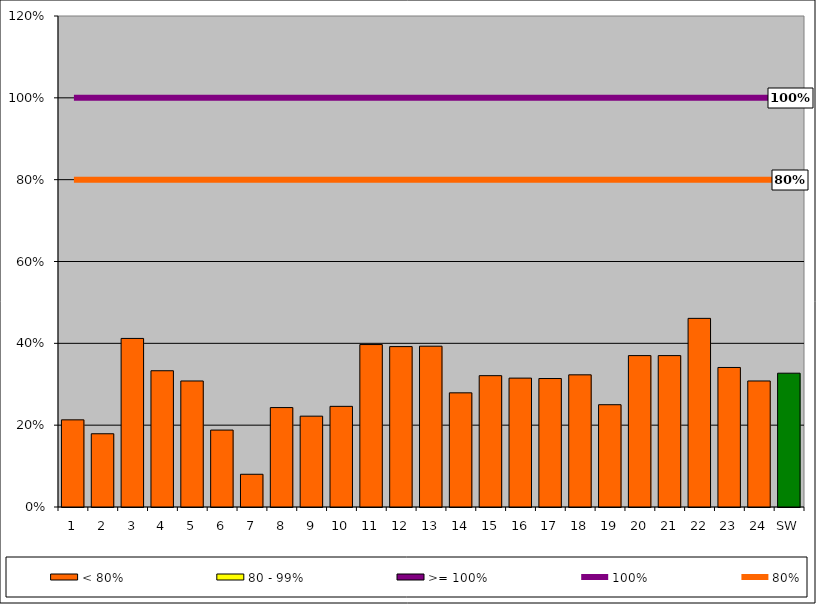
| Category | < 80% | 80 - 99% | >= 100% |
|---|---|---|---|
| 1 | 0.213 | 0 | 0 |
| 2 | 0.179 | 0 | 0 |
| 3 | 0.412 | 0 | 0 |
| 4 | 0.333 | 0 | 0 |
| 5 | 0.308 | 0 | 0 |
| 6 | 0.188 | 0 | 0 |
| 7 | 0.08 | 0 | 0 |
| 8 | 0.243 | 0 | 0 |
| 9 | 0.222 | 0 | 0 |
| 10 | 0.246 | 0 | 0 |
| 11 | 0.397 | 0 | 0 |
| 12 | 0.392 | 0 | 0 |
| 13 | 0.393 | 0 | 0 |
| 14 | 0.279 | 0 | 0 |
| 15 | 0.321 | 0 | 0 |
| 16 | 0.315 | 0 | 0 |
| 17 | 0.314 | 0 | 0 |
| 18 | 0.323 | 0 | 0 |
| 19 | 0.25 | 0 | 0 |
| 20 | 0.37 | 0 | 0 |
| 21 | 0.37 | 0 | 0 |
| 22 | 0.461 | 0 | 0 |
| 23 | 0.341 | 0 | 0 |
| 24 | 0.308 | 0 | 0 |
| SW | 0.327 | 0 | 0 |